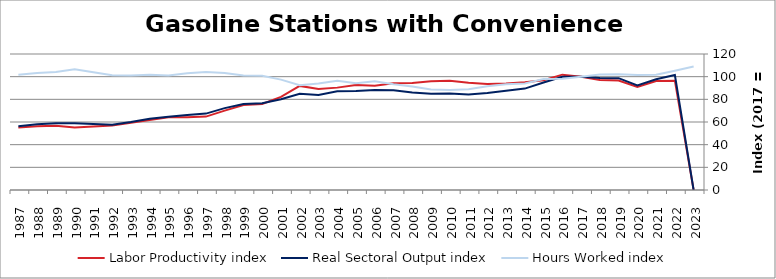
| Category | Labor Productivity index | Real Sectoral Output index | Hours Worked index |
|---|---|---|---|
| 2023.0 | 0 | 0 | 108.97 |
| 2022.0 | 96.473 | 101.478 | 105.188 |
| 2021.0 | 96.121 | 97.716 | 101.659 |
| 2020.0 | 90.951 | 92.313 | 101.498 |
| 2019.0 | 96.662 | 98.662 | 102.069 |
| 2018.0 | 97.031 | 98.878 | 101.903 |
| 2017.0 | 100 | 100 | 100 |
| 2016.0 | 101.778 | 99.982 | 98.235 |
| 2015.0 | 96.821 | 94.81 | 97.923 |
| 2014.0 | 95.1 | 89.459 | 94.069 |
| 2013.0 | 94.004 | 87.615 | 93.203 |
| 2012.0 | 93.542 | 85.547 | 91.452 |
| 2011.0 | 94.624 | 84.185 | 88.968 |
| 2010.0 | 96.497 | 85.127 | 88.218 |
| 2009.0 | 95.867 | 84.992 | 88.656 |
| 2008.0 | 94.356 | 86.118 | 91.27 |
| 2007.0 | 94.258 | 88.011 | 93.372 |
| 2006.0 | 91.909 | 88.239 | 96.007 |
| 2005.0 | 92.578 | 87.289 | 94.286 |
| 2004.0 | 90.329 | 87.108 | 96.434 |
| 2003.0 | 89.177 | 83.757 | 93.922 |
| 2002.0 | 91.837 | 84.924 | 92.473 |
| 2001.0 | 82.219 | 80.068 | 97.383 |
| 2000.0 | 75.961 | 76.516 | 100.73 |
| 1999.0 | 74.969 | 75.799 | 101.107 |
| 1998.0 | 70.014 | 72.231 | 103.167 |
| 1997.0 | 64.748 | 67.42 | 104.127 |
| 1996.0 | 64.244 | 66.187 | 103.024 |
| 1995.0 | 64.139 | 64.737 | 100.932 |
| 1994.0 | 61.836 | 62.911 | 101.739 |
| 1993.0 | 59.268 | 59.924 | 101.106 |
| 1992.0 | 56.958 | 57.615 | 101.153 |
| 1991.0 | 55.983 | 58.147 | 103.866 |
| 1990.0 | 55.218 | 58.803 | 106.493 |
| 1989.0 | 56.591 | 58.883 | 104.05 |
| 1988.0 | 56.157 | 58.007 | 103.294 |
| 1987.0 | 55.194 | 56.147 | 101.726 |